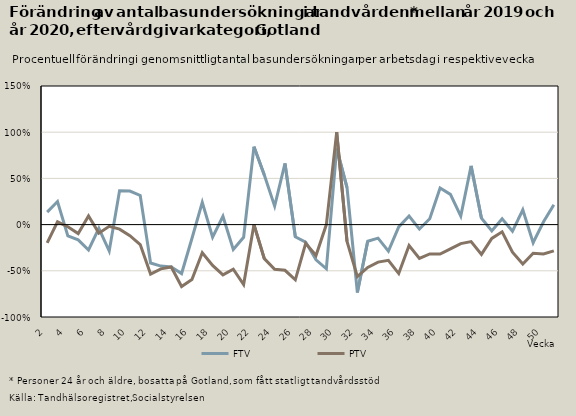
| Category | FTV | PTV |
|---|---|---|
| 2.0 | 0.135 | -0.197 |
| 3.0 | 0.25 | 0.03 |
| 4.0 | -0.123 | -0.023 |
| 5.0 | -0.165 | -0.097 |
| 6.0 | -0.275 | 0.094 |
| 7.0 | -0.04 | -0.092 |
| 8.0 | -0.286 | -0.019 |
| 9.0 | 0.366 | -0.049 |
| 10.0 | 0.363 | -0.12 |
| 11.0 | 0.315 | -0.217 |
| 12.0 | -0.416 | -0.536 |
| 13.0 | -0.449 | -0.479 |
| 14.0 | -0.458 | -0.458 |
| 15.0 | -0.53 | -0.67 |
| 16.0 | -0.15 | -0.594 |
| 17.0 | 0.24 | -0.304 |
| 18.0 | -0.137 | -0.442 |
| 19.0 | 0.09 | -0.544 |
| 20.0 | -0.268 | -0.483 |
| 21.0 | -0.137 | -0.649 |
| 22.0 | 0.843 | 0 |
| 23.0 | 0.537 | -0.368 |
| 24.0 | 0.2 | -0.484 |
| 25.0 | 0.662 | -0.495 |
| 26.0 | -0.132 | -0.598 |
| 27.0 | -0.189 | -0.202 |
| 28.0 | -0.382 | -0.333 |
| 29.0 | -0.478 | 0 |
| 30.0 | 0.824 | 1 |
| 31.0 | 0.4 | -0.182 |
| 32.0 | -0.735 | -0.562 |
| 33.0 | -0.181 | -0.464 |
| 34.0 | -0.147 | -0.406 |
| 35.0 | -0.288 | -0.387 |
| 36.0 | -0.025 | -0.53 |
| 37.0 | 0.093 | -0.227 |
| 38.0 | -0.049 | -0.366 |
| 39.0 | 0.063 | -0.318 |
| 40.0 | 0.396 | -0.319 |
| 41.0 | 0.327 | -0.263 |
| 42.0 | 0.092 | -0.206 |
| 43.0 | 0.635 | -0.184 |
| 44.0 | 0.07 | -0.323 |
| 45.0 | -0.068 | -0.149 |
| 46.0 | 0.063 | -0.079 |
| 47.0 | -0.071 | -0.299 |
| 48.0 | 0.16 | -0.426 |
| 49.0 | -0.196 | -0.311 |
| 50.0 | 0.03 | -0.318 |
| 51.0 | 0.214 | -0.285 |